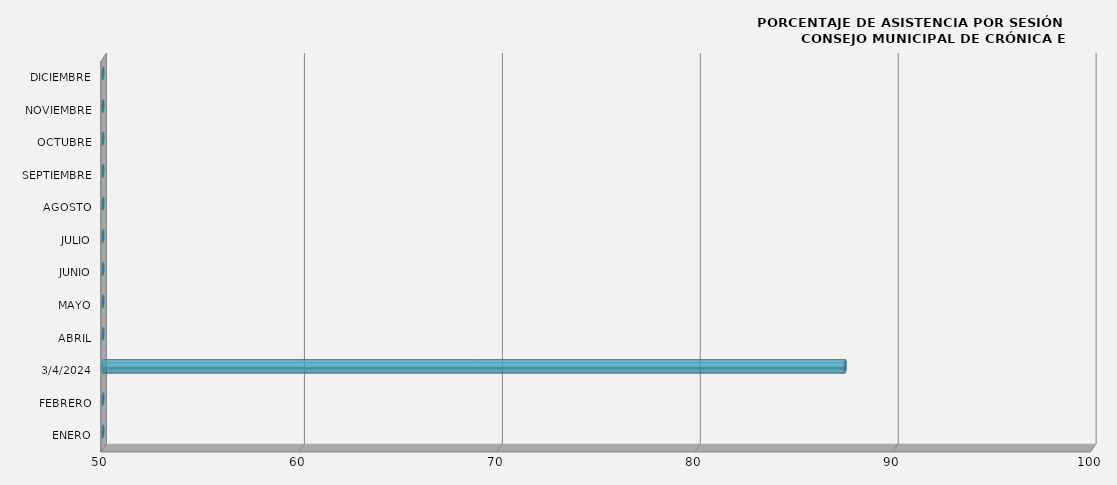
| Category | Series 0 |
|---|---|
| ENERO | 0 |
| FEBRERO | 0 |
| 04/03/2024 | 87.5 |
| ABRIL | 0 |
| MAYO | 0 |
| JUNIO | 0 |
| JULIO | 0 |
| AGOSTO | 0 |
| SEPTIEMBRE | 0 |
| OCTUBRE | 0 |
| NOVIEMBRE | 0 |
| DICIEMBRE | 0 |